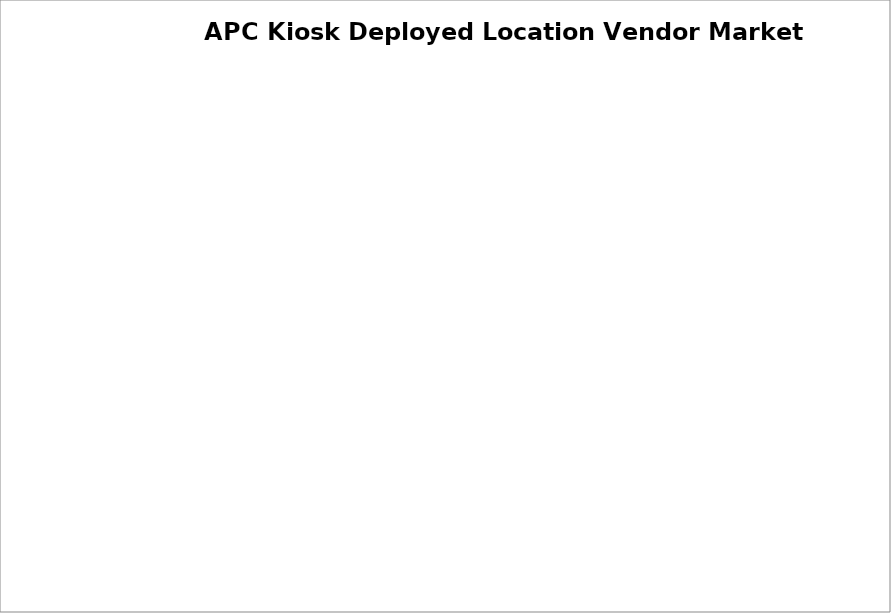
| Category | Airport Installations |
|---|---|
| YVR | 0 |
| XXX | 0 |
| XXX | 0 |
| XXX | 0 |
| XXX | 0 |
| XXX | 0 |
| XXX | 0 |
| XXX | 0 |
| XXX | 0 |
| unknown | 0 |